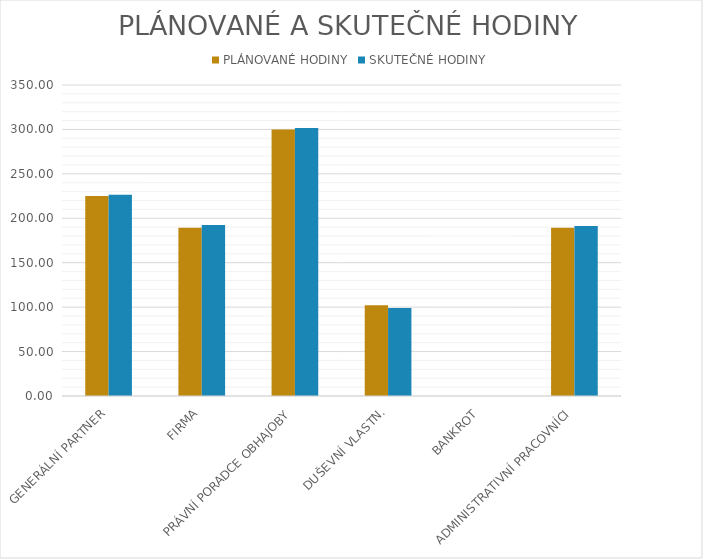
| Category | PLÁNOVANÉ HODINY | SKUTEČNÉ HODINY |
|---|---|---|
| GENERÁLNÍ PARTNER | 225 | 226.5 |
| FIRMA | 189.286 | 192.5 |
| PRÁVNÍ PORADCE OBHAJOBY | 300 | 301.714 |
| DUŠEVNÍ VLASTN. | 102.143 | 99 |
| BANKROT | 0 | 0 |
| ADMINISTRATIVNÍ PRACOVNÍCI | 189.286 | 191.429 |